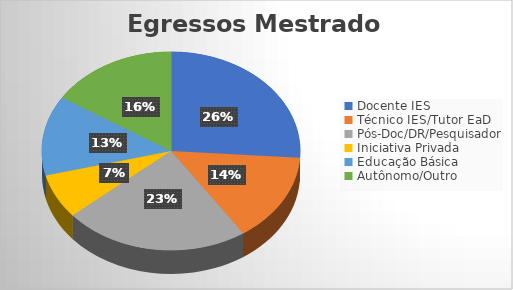
| Category | Series 0 |
|---|---|
| Docente IES | 18 |
| Técnico IES/Tutor EaD | 10 |
| Pós-Doc/DR/Pesquisador | 16 |
| Iniciativa Privada | 5 |
| Educação Básica | 9 |
| Autônomo/Outro | 11 |